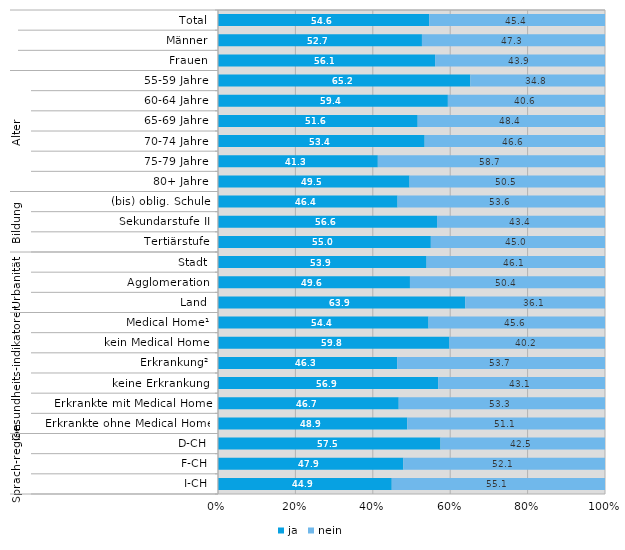
| Category | ja | nein |
|---|---|---|
| 0 | 54.6 | 45.4 |
| 1 | 52.7 | 47.3 |
| 2 | 56.1 | 43.9 |
| 3 | 65.2 | 34.8 |
| 4 | 59.4 | 40.6 |
| 5 | 51.6 | 48.4 |
| 6 | 53.4 | 46.6 |
| 7 | 41.3 | 58.7 |
| 8 | 49.5 | 50.5 |
| 9 | 46.4 | 53.6 |
| 10 | 56.6 | 43.4 |
| 11 | 55 | 45 |
| 12 | 53.9 | 46.1 |
| 13 | 49.6 | 50.4 |
| 14 | 63.9 | 36.1 |
| 15 | 54.4 | 45.6 |
| 16 | 59.8 | 40.2 |
| 17 | 46.3 | 53.7 |
| 18 | 56.9 | 43.1 |
| 19 | 46.7 | 53.3 |
| 20 | 48.9 | 51.1 |
| 21 | 57.5 | 42.5 |
| 22 | 47.9 | 52.1 |
| 23 | 44.9 | 55.1 |